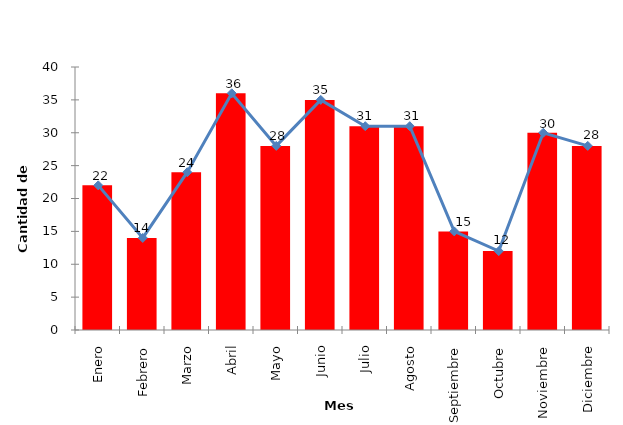
| Category | Series 1 |
|---|---|
| Enero | 22 |
| Febrero | 14 |
| Marzo | 24 |
| Abril | 36 |
| Mayo | 28 |
| Junio | 35 |
| Julio | 31 |
| Agosto | 31 |
| Septiembre | 15 |
| Octubre | 12 |
| Noviembre | 30 |
| Diciembre | 28 |